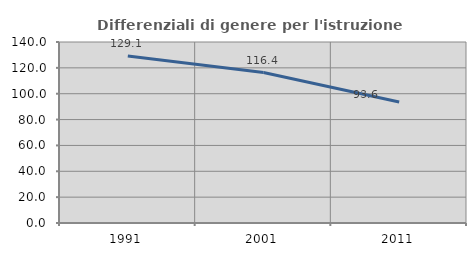
| Category | Differenziali di genere per l'istruzione superiore |
|---|---|
| 1991.0 | 129.103 |
| 2001.0 | 116.361 |
| 2011.0 | 93.63 |